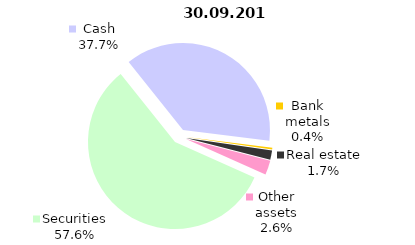
| Category | 30.09.2018 |
|---|---|
| Securities | 1527.1 |
| Cash | 999.2 |
| Bank metals | 9.4 |
| Real estate | 45.5 |
| Other assets | 70.1 |